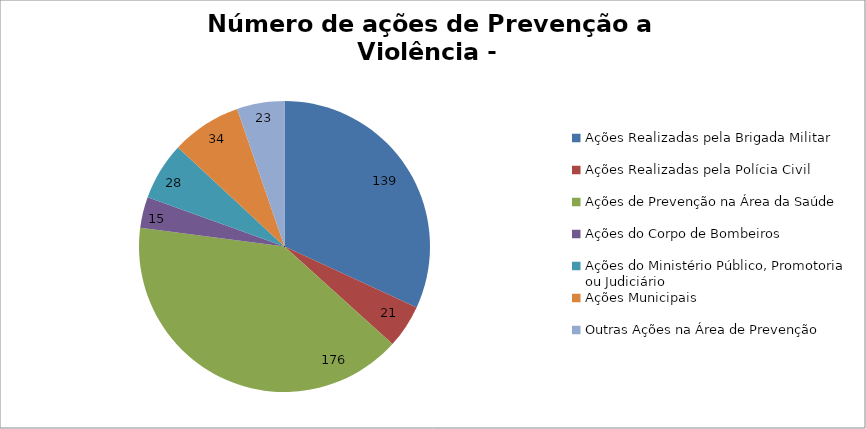
| Category | Número de Ações |
|---|---|
| Ações Realizadas pela Brigada Militar | 139 |
| Ações Realizadas pela Polícia Civil | 21 |
| Ações de Prevenção na Área da Saúde | 176 |
| Ações do Corpo de Bombeiros | 15 |
| Ações do Ministério Público, Promotoria ou Judiciário | 28 |
| Ações Municipais | 34 |
| Outras Ações na Área de Prevenção | 23 |